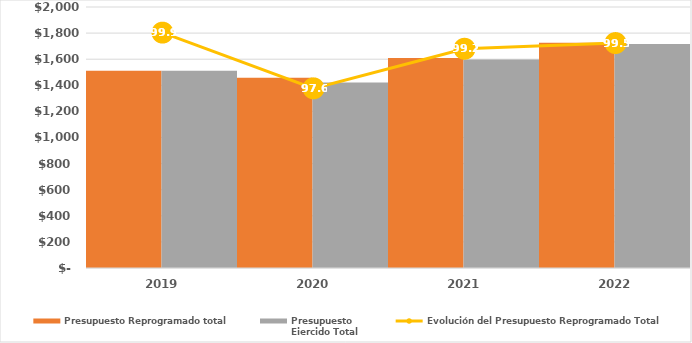
| Category | Presupuesto Reprogramado total | Presupuesto
Ejercido Total |
|---|---|---|
| 2019.0 | 1512433.503 | 1511221.007 |
| 2020.0 | 1457643.367 | 1422248.821 |
| 2021.0 | 1609932.387 | 1597687.431 |
| 2022.0 | 1725174.252 | 1716208.933 |